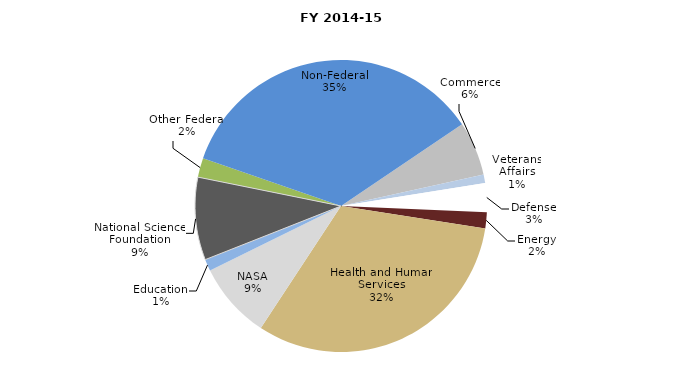
| Category | Series 0 |
|---|---|
| Commerce | 52616568 |
| Veterans Affairs | 8160588 |
| Defense | 28060710 |
| Energy | 15802707 |
| Health and Human Services | 279173913.7 |
| NASA | 74390057 |
| Education | 11335618 |
| National Science Foundation | 80430000 |
| Other Federal | 18704547.92 |
| Non-Federal | 309670599.27 |